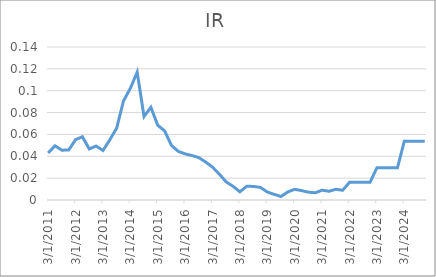
| Category | IR | GDP |
|---|---|---|
| 3/31/11 | 0.043 |  |
| 6/30/11 | 0.05 |  |
| 9/30/11 | 0.046 |  |
| 12/31/11 | 0.046 |  |
| 3/31/12 | 0.055 |  |
| 6/30/12 | 0.058 |  |
| 9/30/12 | 0.047 |  |
| 12/31/12 | 0.049 |  |
| 3/31/13 | 0.045 |  |
| 6/30/13 | 0.055 |  |
| 9/30/13 | 0.066 |  |
| 12/31/13 | 0.091 |  |
| 3/31/14 | 0.102 |  |
| 6/30/14 | 0.117 |  |
| 9/30/14 | 0.076 |  |
| 12/31/14 | 0.085 |  |
| 3/31/15 | 0.068 |  |
| 6/30/15 | 0.063 |  |
| 9/30/15 | 0.05 |  |
| 12/31/15 | 0.045 |  |
| 3/31/16 | 0.042 |  |
| 6/30/16 | 0.041 |  |
| 9/30/16 | 0.039 |  |
| 12/31/16 | 0.035 |  |
| 3/31/17 | 0.03 |  |
| 6/30/17 | 0.024 |  |
| 9/30/17 | 0.017 |  |
| 12/31/17 | 0.013 |  |
| 3/31/18 | 0.007 |  |
| 6/30/18 | 0.013 |  |
| 9/30/18 | 0.012 |  |
| 12/31/18 | 0.011 |  |
| 3/31/19 | 0.007 |  |
| 6/30/19 | 0.005 |  |
| 9/30/19 | 0.003 |  |
| 12/31/19 | 0.007 |  |
| 3/31/20 | 0.01 |  |
| 6/30/20 | 0.009 |  |
| 9/30/20 | 0.007 |  |
| 12/31/20 | 0.007 |  |
| 3/31/21 | 0.009 |  |
| 6/30/21 | 0.008 |  |
| 9/30/21 | 0.01 |  |
| 12/31/21 | 0.009 |  |
| 3/31/22 | 0.016 |  |
| 6/30/22 | 0.016 |  |
| 9/30/22 | 0.016 |  |
| 12/31/22 | 0.016 |  |
| 3/31/23 | 0.03 |  |
| 6/30/23 | 0.03 |  |
| 9/30/23 | 0.03 |  |
| 12/31/23 | 0.03 |  |
| 3/31/24 | 0.054 |  |
| 6/30/24 | 0.054 |  |
| 9/30/24 | 0.054 |  |
| 12/31/24 | 0.054 |  |